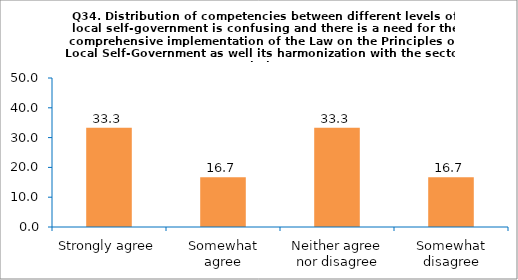
| Category | Series 0 |
|---|---|
| Strongly agree | 33.333 |
| Somewhat agree | 16.667 |
| Neither agree nor disagree | 33.333 |
| Somewhat disagree | 16.667 |